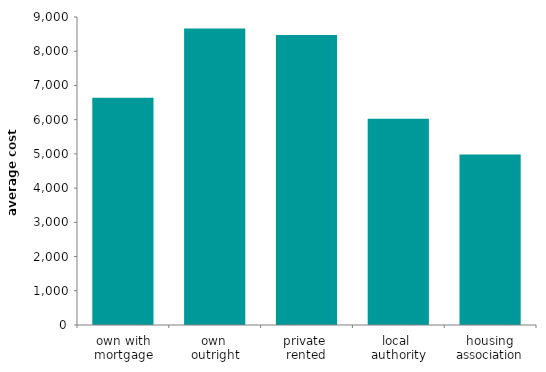
| Category | Series 0 |
|---|---|
| own with mortgage | 6639.064 |
| own 
outright | 8666.577 |
| private 
rented | 8475.171 |
| local 
authority | 6029.545 |
| housing association | 4985.24 |